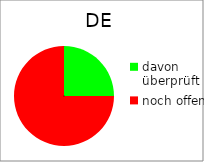
| Category | DE |
|---|---|
| davon überprüft | 2 |
| noch offen | 6 |